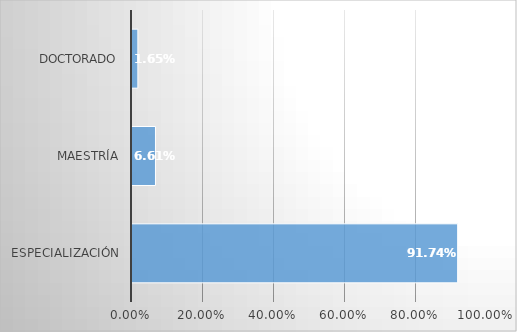
| Category | Series 0 |
|---|---|
| Especialización | 0.917 |
| Maestría | 0.066 |
| Doctorado | 0.017 |